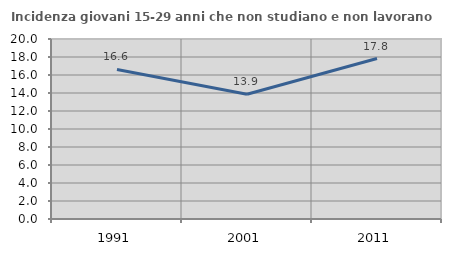
| Category | Incidenza giovani 15-29 anni che non studiano e non lavorano  |
|---|---|
| 1991.0 | 16.613 |
| 2001.0 | 13.861 |
| 2011.0 | 17.829 |